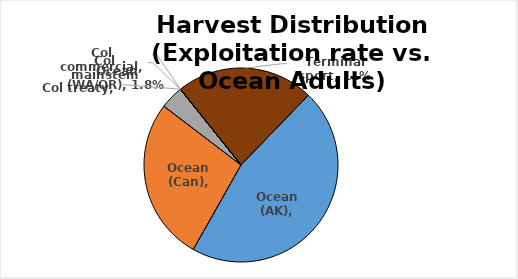
| Category | Series 0 |
|---|---|
| Ocean (AK) | 0.216 |
| Ocean (Can) | 0.127 |
| Ocean (WA/OR) | 0.018 |
| Col mainstem sport | 0 |
| Col commercial | 0 |
| Col treaty | 0 |
| Terminal sport | 0.108 |